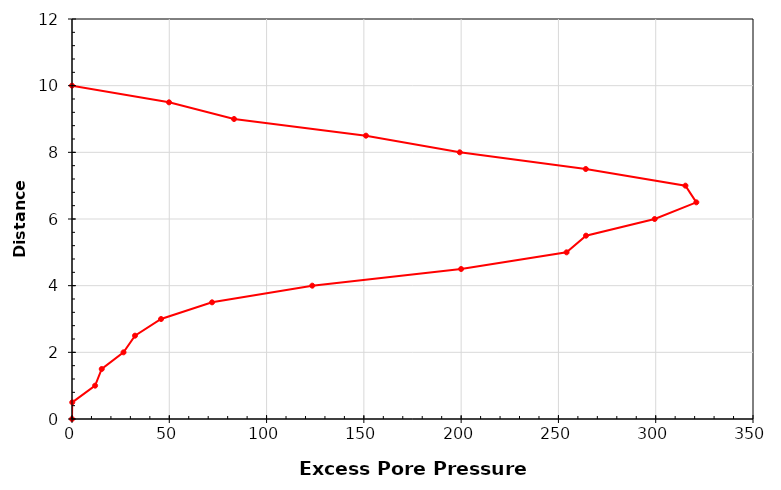
| Category | Series 0 |
|---|---|
| 0.0 | 0 |
| 0.1235 | 0.5 |
| 11.879 | 1 |
| 15.279 | 1.5 |
| 26.479000000000003 | 2 |
| 32.379 | 2.5 |
| 45.778999999999996 | 3 |
| 71.979 | 3.5 |
| 123.479 | 4 |
| 199.97899999999998 | 4.5 |
| 254.179 | 5 |
| 264.17900000000003 | 5.5 |
| 299.47900000000004 | 6 |
| 320.879 | 6.5 |
| 315.279 | 7 |
| 264.079 | 7.5 |
| 199.279 | 8 |
| 151.07899999999998 | 8.5 |
| 83.27900000000001 | 9 |
| 49.879 | 9.5 |
| 0.0 | 10 |